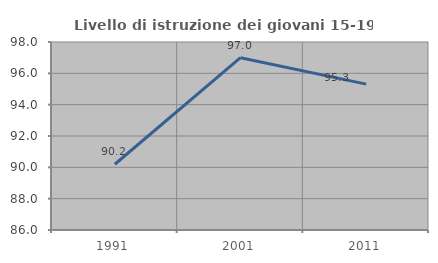
| Category | Livello di istruzione dei giovani 15-19 anni |
|---|---|
| 1991.0 | 90.196 |
| 2001.0 | 97 |
| 2011.0 | 95.312 |